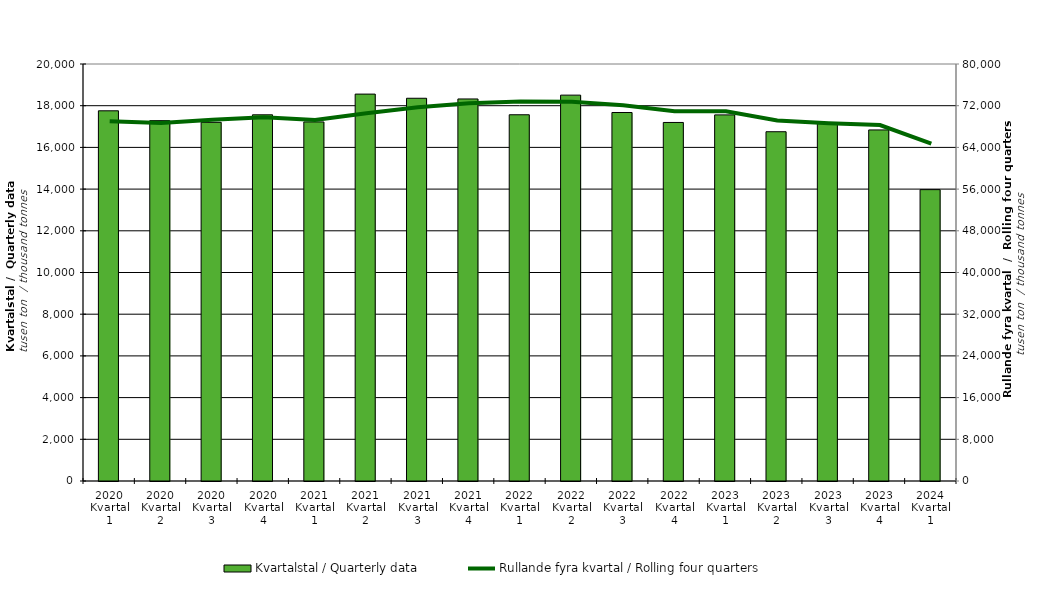
| Category | Kvartalstal / Quarterly data |
|---|---|
| 2020 Kvartal 1 | 17755.324 |
| 2020 Kvartal 2 | 17283.081 |
| 2020 Kvartal 3 | 17203.185 |
| 2020 Kvartal 4 | 17563.403 |
| 2021 Kvartal 1 | 17221.505 |
| 2021 Kvartal 2 | 18556.292 |
| 2021 Kvartal 3 | 18357.009 |
| 2021 Kvartal 4 | 18323.49 |
| 2022 Kvartal 1 | 17565.59 |
| 2022 Kvartal 2 | 18506.797 |
| 2022 Kvartal 3 | 17673.481 |
| 2022 Kvartal 4 | 17195.877 |
| 2023 Kvartal 1 | 17559.946 |
| 2023 Kvartal 2 | 16751.955 |
| 2023 Kvartal 3 | 17142.463 |
| 2023 Kvartal 4 | 16838.192 |
| 2024 Kvartal 1 | 13974.311 |